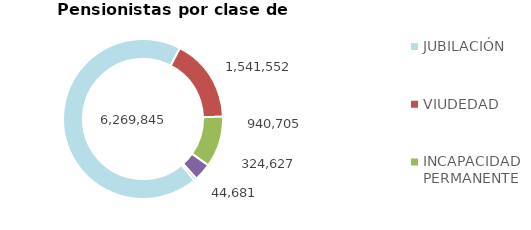
| Category | Series 0 |
|---|---|
| JUBILACIÓN | 6269845 |
| VIUDEDAD | 1541552 |
| INCAPACIDAD PERMANENTE | 940705 |
| ORFANDAD | 324627 |
| FAVOR DE FAMILIARES | 44681 |